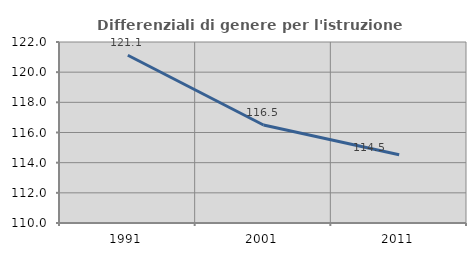
| Category | Differenziali di genere per l'istruzione superiore |
|---|---|
| 1991.0 | 121.121 |
| 2001.0 | 116.5 |
| 2011.0 | 114.528 |